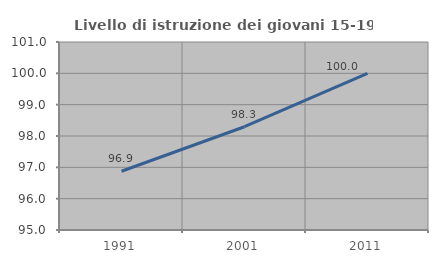
| Category | Livello di istruzione dei giovani 15-19 anni |
|---|---|
| 1991.0 | 96.875 |
| 2001.0 | 98.295 |
| 2011.0 | 100 |